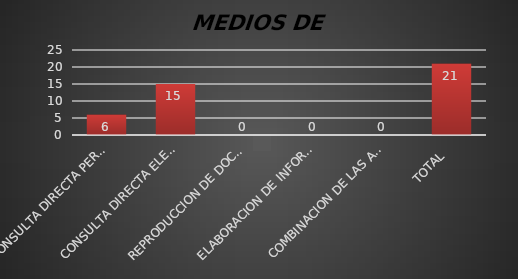
| Category | Series 1 |
|---|---|
| CONSULTA DIRECTA PERSONAL | 6 |
| CONSULTA DIRECTA ELECTRONICA | 15 |
| REPRODUCCION DE DOCUMENTOS  | 0 |
| ELABORACION DE INFORMES ESPECIFICOS  | 0 |
| COMBINACION DE LAS ANTERIORES | 0 |
| TOTAL  | 21 |